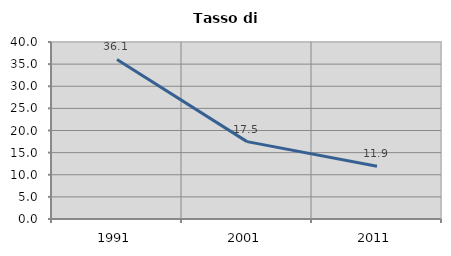
| Category | Tasso di disoccupazione   |
|---|---|
| 1991.0 | 36.063 |
| 2001.0 | 17.489 |
| 2011.0 | 11.942 |